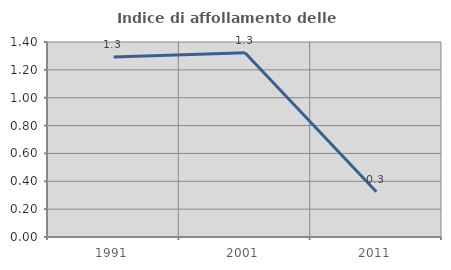
| Category | Indice di affollamento delle abitazioni  |
|---|---|
| 1991.0 | 1.292 |
| 2001.0 | 1.322 |
| 2011.0 | 0.325 |